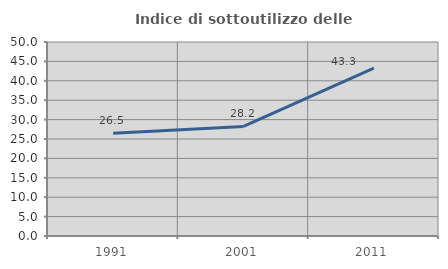
| Category | Indice di sottoutilizzo delle abitazioni  |
|---|---|
| 1991.0 | 26.512 |
| 2001.0 | 28.23 |
| 2011.0 | 43.269 |